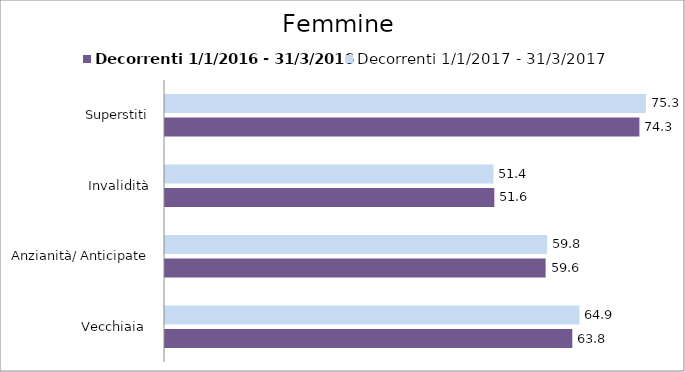
| Category | Decorrenti 1/1/2016 - 31/3/2016 | Decorrenti 1/1/2017 - 31/3/2017 |
|---|---|---|
| Vecchiaia  | 63.77 | 64.89 |
| Anzianità/ Anticipate | 59.59 | 59.83 |
| Invalidità | 51.56 | 51.42 |
| Superstiti | 74.27 | 75.29 |